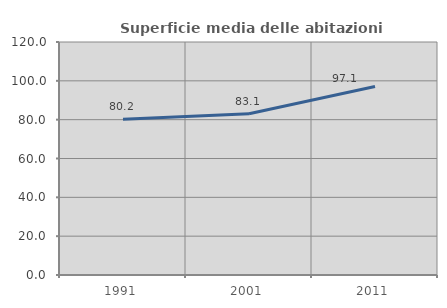
| Category | Superficie media delle abitazioni occupate |
|---|---|
| 1991.0 | 80.218 |
| 2001.0 | 83.068 |
| 2011.0 | 97.074 |